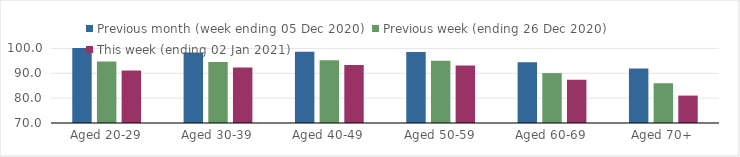
| Category | Previous month (week ending 05 Dec 2020) | Previous week (ending 26 Dec 2020) | This week (ending 02 Jan 2021) |
|---|---|---|---|
| Aged 20-29 | 100.14 | 94.77 | 91.15 |
| Aged 30-39 | 98.41 | 94.58 | 92.35 |
| Aged 40-49 | 98.69 | 95.22 | 93.3 |
| Aged 50-59 | 98.53 | 95.02 | 93.14 |
| Aged 60-69 | 94.41 | 90.07 | 87.38 |
| Aged 70+ | 91.91 | 85.99 | 81.03 |